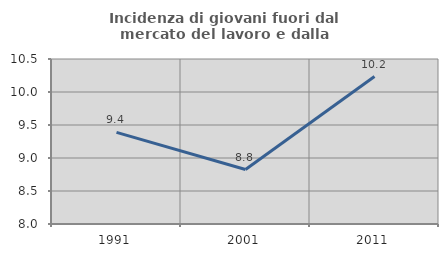
| Category | Incidenza di giovani fuori dal mercato del lavoro e dalla formazione  |
|---|---|
| 1991.0 | 9.388 |
| 2001.0 | 8.826 |
| 2011.0 | 10.234 |